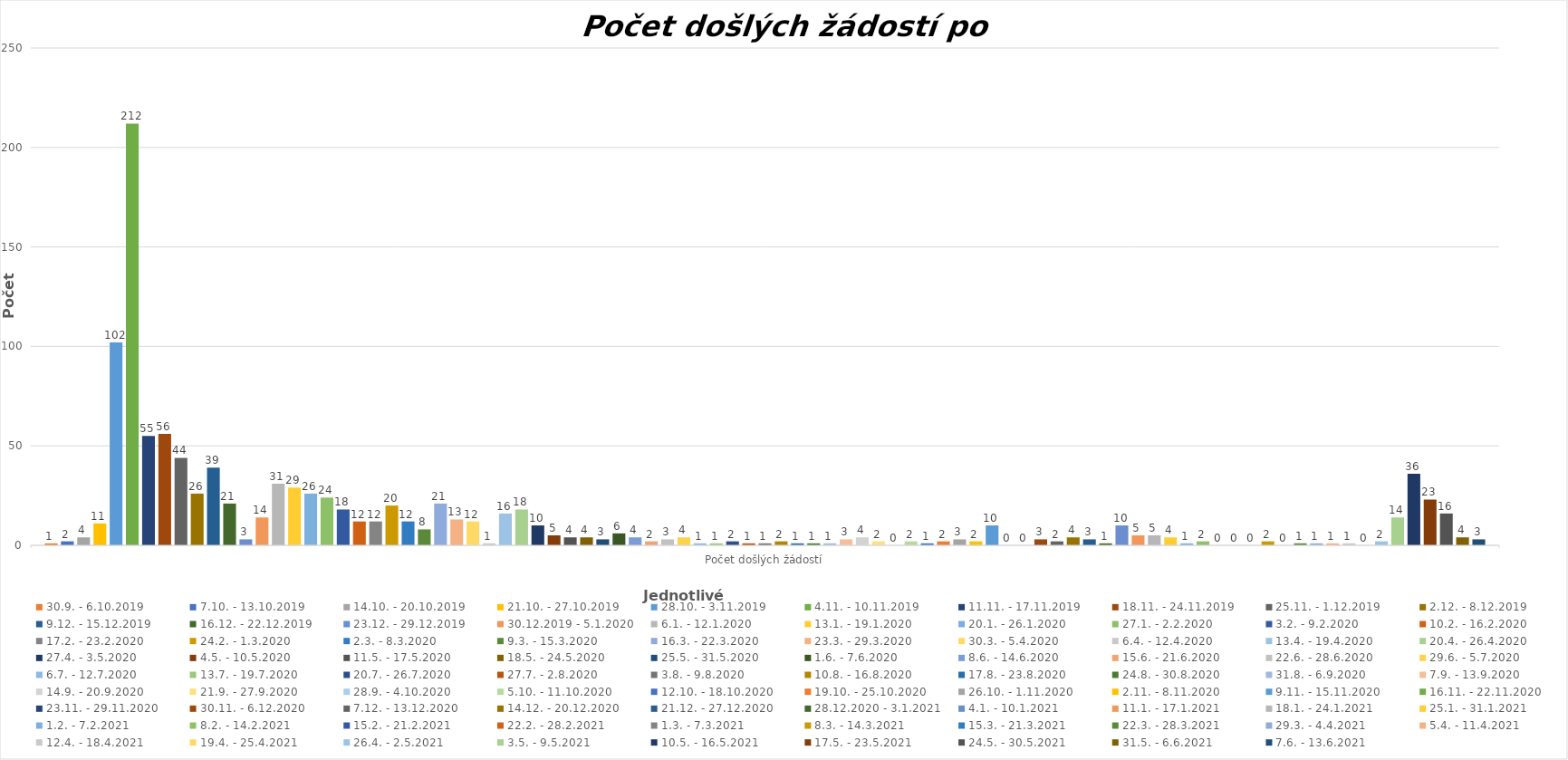
| Category | 30.9. - 6.10.2019 | 7.10. - 13.10.2019 | 14.10. - 20.10.2019 | 21.10. - 27.10.2019 | 28.10. - 3.11.2019 | 4.11. - 10.11.2019 | 11.11. - 17.11.2019 | 18.11. - 24.11.2019 | 25.11. - 1.12.2019 | 2.12. - 8.12.2019 | 9.12. - 15.12.2019 | 16.12. - 22.12.2019 | 23.12. - 29.12.2019 | 30.12.2019 - 5.1.2020 | 6.1. - 12.1.2020 | 13.1. - 19.1.2020 | 20.1. - 26.1.2020 | 27.1. - 2.2.2020 | 3.2. - 9.2.2020 | 10.2. - 16.2.2020 | 17.2. - 23.2.2020 | 24.2. - 1.3.2020 | 2.3. - 8.3.2020 | 9.3. - 15.3.2020 | 16.3. - 22.3.2020 | 23.3. - 29.3.2020 | 30.3. - 5.4.2020 | 6.4. - 12.4.2020 | 13.4. - 19.4.2020 | 20.4. - 26.4.2020 | 27.4. - 3.5.2020 | 4.5. - 10.5.2020 | 11.5. - 17.5.2020 | 18.5. - 24.5.2020 | 25.5. - 31.5.2020 | 1.6. - 7.6.2020 | 8.6. - 14.6.2020 | 15.6. - 21.6.2020 | 22.6. - 28.6.2020 | 29.6. - 5.7.2020 | 6.7. - 12.7.2020 | 13.7. - 19.7.2020 | 20.7. - 26.7.2020 | 27.7. - 2.8.2020 | 3.8. - 9.8.2020 | 10.8. - 16.8.2020 | 17.8. - 23.8.2020 | 24.8. - 30.8.2020 | 31.8. - 6.9.2020 | 7.9. - 13.9.2020 | 14.9. - 20.9.2020 | 21.9. - 27.9.2020 | 28.9. - 4.10.2020 | 5.10. - 11.10.2020 | 12.10. - 18.10.2020 | 19.10. - 25.10.2020 | 26.10. - 1.11.2020 | 2.11. - 8.11.2020 | 9.11. - 15.11.2020 | 16.11. - 22.11.2020 | 23.11. - 29.11.2020 | 30.11. - 6.12.2020 | 7.12. - 13.12.2020 | 14.12. - 20.12.2020 | 21.12. - 27.12.2020 | 28.12.2020 - 3.1.2021 | 4.1. - 10.1.2021 | 11.1. - 17.1.2021 | 18.1. - 24.1.2021 | 25.1. - 31.1.2021 | 1.2. - 7.2.2021 | 8.2. - 14.2.2021 | 15.2. - 21.2.2021 | 22.2. - 28.2.2021 | 1.3. - 7.3.2021 | 8.3. - 14.3.2021 | 15.3. - 21.3.2021 | 22.3. - 28.3.2021 | 29.3. - 4.4.2021 | 5.4. - 11.4.2021 | 12.4. - 18.4.2021 | 19.4. - 25.4.2021 | 26.4. - 2.5.2021 | 3.5. - 9.5.2021 | 10.5. - 16.5.2021 | 17.5. - 23.5.2021 | 24.5. - 30.5.2021 | 31.5. - 6.6.2021 | 7.6. - 13.6.2021 |
|---|---|---|---|---|---|---|---|---|---|---|---|---|---|---|---|---|---|---|---|---|---|---|---|---|---|---|---|---|---|---|---|---|---|---|---|---|---|---|---|---|---|---|---|---|---|---|---|---|---|---|---|---|---|---|---|---|---|---|---|---|---|---|---|---|---|---|---|---|---|---|---|---|---|---|---|---|---|---|---|---|---|---|---|---|---|---|---|---|---|
| Počet došlých žádostí | 1 | 2 | 4 | 11 | 102 | 212 | 55 | 56 | 44 | 26 | 39 | 21 | 3 | 14 | 31 | 29 | 26 | 24 | 18 | 12 | 12 | 20 | 12 | 8 | 21 | 13 | 12 | 1 | 16 | 18 | 10 | 5 | 4 | 4 | 3 | 6 | 4 | 2 | 3 | 4 | 1 | 1 | 2 | 1 | 1 | 2 | 1 | 1 | 1 | 3 | 4 | 2 | 0 | 2 | 1 | 2 | 3 | 2 | 10 | 0 | 0 | 3 | 2 | 4 | 3 | 1 | 10 | 5 | 5 | 4 | 1 | 2 | 0 | 0 | 0 | 2 | 0 | 1 | 1 | 1 | 1 | 0 | 2 | 14 | 36 | 23 | 16 | 4 | 3 |